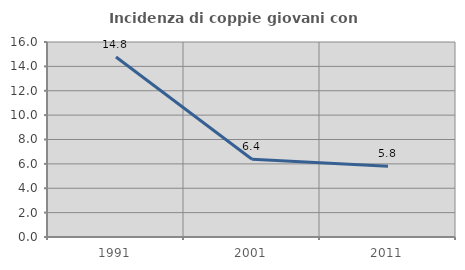
| Category | Incidenza di coppie giovani con figli |
|---|---|
| 1991.0 | 14.769 |
| 2001.0 | 6.383 |
| 2011.0 | 5.797 |